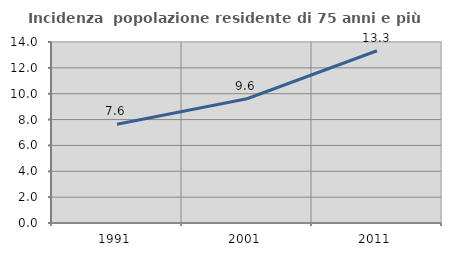
| Category | Incidenza  popolazione residente di 75 anni e più |
|---|---|
| 1991.0 | 7.638 |
| 2001.0 | 9.613 |
| 2011.0 | 13.325 |